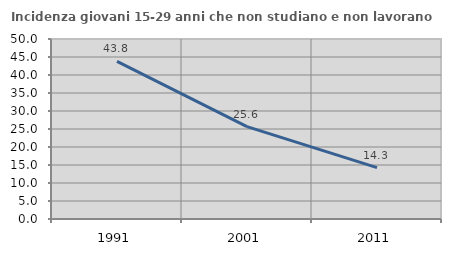
| Category | Incidenza giovani 15-29 anni che non studiano e non lavorano  |
|---|---|
| 1991.0 | 43.801 |
| 2001.0 | 25.641 |
| 2011.0 | 14.286 |